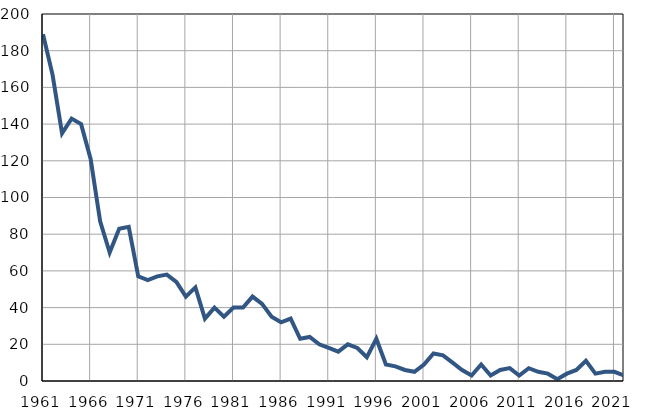
| Category | Infants
deaths |
|---|---|
| 1961.0 | 189 |
| 1962.0 | 167 |
| 1963.0 | 135 |
| 1964.0 | 143 |
| 1965.0 | 140 |
| 1966.0 | 121 |
| 1967.0 | 87 |
| 1968.0 | 70 |
| 1969.0 | 83 |
| 1970.0 | 84 |
| 1971.0 | 57 |
| 1972.0 | 55 |
| 1973.0 | 57 |
| 1974.0 | 58 |
| 1975.0 | 54 |
| 1976.0 | 46 |
| 1977.0 | 51 |
| 1978.0 | 34 |
| 1979.0 | 40 |
| 1980.0 | 35 |
| 1981.0 | 40 |
| 1982.0 | 40 |
| 1983.0 | 46 |
| 1984.0 | 42 |
| 1985.0 | 35 |
| 1986.0 | 32 |
| 1987.0 | 34 |
| 1988.0 | 23 |
| 1989.0 | 24 |
| 1990.0 | 20 |
| 1991.0 | 18 |
| 1992.0 | 16 |
| 1993.0 | 20 |
| 1994.0 | 18 |
| 1995.0 | 13 |
| 1996.0 | 23 |
| 1997.0 | 9 |
| 1998.0 | 8 |
| 1999.0 | 6 |
| 2000.0 | 5 |
| 2001.0 | 9 |
| 2002.0 | 15 |
| 2003.0 | 14 |
| 2004.0 | 10 |
| 2005.0 | 6 |
| 2006.0 | 3 |
| 2007.0 | 9 |
| 2008.0 | 3 |
| 2009.0 | 6 |
| 2010.0 | 7 |
| 2011.0 | 3 |
| 2012.0 | 7 |
| 2013.0 | 5 |
| 2014.0 | 4 |
| 2015.0 | 1 |
| 2016.0 | 4 |
| 2017.0 | 6 |
| 2018.0 | 11 |
| 2019.0 | 4 |
| 2020.0 | 5 |
| 2021.0 | 5 |
| 2022.0 | 3 |